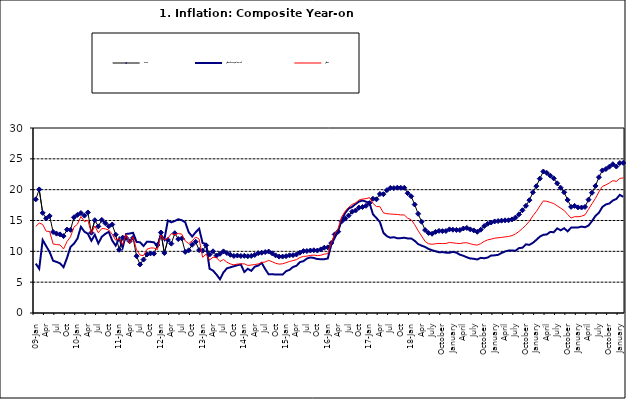
| Category | Food | All Items less Farm Produce | All Items |
|---|---|---|---|
| 09-Jan | 18.436 | 8.013 | 14.034 |
| Feb | 20.041 | 7.178 | 14.584 |
| Mar | 16.233 | 11.842 | 14.366 |
| Apr | 15.342 | 10.85 | 13.268 |
| May | 15.74 | 9.88 | 13.212 |
| June | 13.138 | 8.472 | 11.194 |
| Jul | 12.867 | 8.285 | 11.09 |
| Aug | 12.746 | 8.044 | 11.046 |
| Sep | 12.472 | 7.431 | 10.39 |
| Oct | 13.524 | 8.933 | 11.588 |
| Nov | 13.482 | 10.702 | 12.368 |
| Dec | 15.518 | 11.249 | 13.93 |
| 10-Jan | 15.918 | 12.063 | 14.398 |
| Feb | 16.208 | 13.978 | 15.649 |
| Mar | 15.79 | 13.184 | 14.812 |
| Apr | 16.306 | 12.844 | 15.044 |
| May | 13.023 | 11.711 | 12.915 |
| Jun | 15.053 | 12.686 | 14.099 |
| Jul | 14.043 | 11.287 | 13.002 |
| Aug | 15.09 | 12.366 | 13.702 |
| Sep | 14.57 | 12.83 | 13.65 |
| Oct | 14.065 | 13.168 | 13.45 |
| Nov | 14.351 | 11.746 | 12.766 |
| Dec | 12.701 | 10.917 | 11.815 |
| 11-Jan | 10.255 | 12.118 | 12.08 |
| Feb | 12.221 | 10.569 | 11.1 |
| Mar | 12.169 | 12.815 | 12.779 |
| Apr | 11.629 | 12.882 | 11.291 |
| May | 12.179 | 13.006 | 12.352 |
| Jun | 9.22 | 11.524 | 10.23 |
| Jul | 7.877 | 11.472 | 9.397 |
| Aug | 8.665 | 10.863 | 9.301 |
| Sep | 9.479 | 11.567 | 10.339 |
| Oct | 9.656 | 11.539 | 10.544 |
| Nov | 9.623 | 11.459 | 10.54 |
| Dec | 11.02 | 10.822 | 10.283 |
| 12-Jan | 13.053 | 12.748 | 12.626 |
| 12-Feb | 9.729 | 11.901 | 11.866 |
| 12-Mar | 11.848 | 14.995 | 12.111 |
| Apr | 11.246 | 14.703 | 12.866 |
| May | 12.942 | 14.926 | 12.688 |
| Jun | 11.991 | 15.199 | 12.892 |
| Jul | 12.093 | 15.045 | 12.797 |
| Aug | 9.91 | 14.714 | 11.689 |
| Sep | 10.164 | 13.101 | 11.253 |
| Oct | 11.064 | 12.398 | 11.693 |
| Nov | 11.553 | 13.092 | 12.32 |
| Dec | 10.199 | 13.685 | 11.981 |
| 13-Jan | 10.106 | 11.342 | 9.031 |
| Feb | 10.973 | 11.184 | 9.542 |
| Mar | 9.482 | 7.179 | 8.593 |
| Apr | 10.006 | 6.874 | 9.052 |
| May | 9.321 | 6.227 | 8.964 |
| Jun | 9.606 | 5.472 | 8.353 |
| Jul | 9.994 | 6.58 | 8.682 |
| Aug | 9.723 | 7.245 | 8.231 |
| Sep | 9.437 | 7.41 | 7.952 |
| Oct | 9.249 | 7.579 | 7.807 |
| Nov | 9.313 | 7.75 | 7.931 |
| Dec | 9.253 | 7.872 | 7.957 |
| 14-Jan | 9.271 | 6.648 | 7.977 |
| Feb | 9.207 | 7.166 | 7.707 |
| Mar | 9.254 | 6.836 | 7.783 |
| Apr | 9.414 | 7.508 | 7.851 |
| May | 9.698 | 7.693 | 7.965 |
| Jun | 9.776 | 8.122 | 8.167 |
| Jul | 9.878 | 7.116 | 8.281 |
| Aug | 9.959 | 6.264 | 8.534 |
| Sep | 9.676 | 6.278 | 8.317 |
| Oct | 9.343 | 6.252 | 8.06 |
| Nov | 9.144 | 6.255 | 7.927 |
| Dec | 9.152 | 6.225 | 7.978 |
| 15-Jan | 9.215 | 6.787 | 8.157 |
| Feb | 9.359 | 6.994 | 8.359 |
| Mar | 9.376 | 7.46 | 8.494 |
| Apr | 9.49 | 7.661 | 8.655 |
| May | 9.782 | 8.253 | 9.003 |
| Jun | 10.041 | 8.403 | 9.168 |
| Jul | 10.049 | 8.83 | 9.218 |
| Aug | 10.131 | 9.01 | 9.336 |
| Sep | 10.174 | 8.928 | 9.394 |
| Oct | 10.129 | 8.742 | 9.296 |
| Nov | 10.321 | 8.732 | 9.368 |
| Dec | 10.588 | 8.727 | 9.554 |
| 16-Jan | 10.642 | 8.841 | 9.617 |
| Feb | 11.348 | 11.041 | 11.379 |
| Mar | 12.745 | 12.17 | 12.775 |
| Apr | 13.194 | 13.352 | 13.721 |
| May | 14.861 | 15.054 | 15.577 |
| Jun | 15.302 | 16.224 | 16.48 |
| Jul | 15.799 | 16.929 | 17.127 |
| Aug | 16.427 | 17.208 | 17.609 |
| Sep | 16.622 | 17.666 | 17.852 |
| Oct | 17.09 | 18.067 | 18.33 |
| Nov | 17.191 | 18.241 | 18.476 |
| Dec | 17.388 | 18.052 | 18.547 |
| 17-Jan | 17.818 | 17.867 | 18.719 |
| Feb | 18.528 | 16.011 | 17.78 |
| Mar | 18.436 | 15.404 | 17.256 |
| Apr | 19.303 | 14.75 | 17.244 |
| May | 19.266 | 13.016 | 16.251 |
| Jun | 19.915 | 12.455 | 16.098 |
| Jul | 20.284 | 12.207 | 16.053 |
| Aug | 20.251 | 12.296 | 16.012 |
| Sep | 20.321 | 12.123 | 15.979 |
| Oct | 20.306 | 12.142 | 15.905 |
| Nov | 20.308 | 12.206 | 15.901 |
| Dec | 19.415 | 12.089 | 15.372 |
| 18-Jan | 18.919 | 12.09 | 15.127 |
| Feb | 17.588 | 11.707 | 14.33 |
| Mar | 16.08 | 11.181 | 13.337 |
| Apr | 14.799 | 10.92 | 12.482 |
| May | 13.448 | 10.71 | 11.608 |
| June | 12.977 | 10.387 | 11.231 |
| July | 12.85 | 10.183 | 11.142 |
| August | 13.158 | 10.015 | 11.227 |
| September | 13.309 | 9.838 | 11.284 |
| October | 13.277 | 9.882 | 11.259 |
| November | 13.301 | 9.787 | 11.281 |
| December | 13.559 | 9.771 | 11.442 |
| January | 13.505 | 9.91 | 11.374 |
| February | 13.473 | 9.8 | 11.306 |
| March | 13.451 | 9.461 | 11.251 |
| April | 13.701 | 9.28 | 11.372 |
| May | 13.794 | 9.033 | 11.396 |
| June | 13.558 | 8.841 | 11.217 |
| July | 13.392 | 8.798 | 11.084 |
| August | 13.17 | 8.678 | 11.016 |
| September | 13.507 | 8.945 | 11.244 |
| October | 14.088 | 8.876 | 11.607 |
| November | 14.482 | 8.993 | 11.854 |
| December | 14.667 | 9.331 | 11.982 |
| January | 14.849 | 9.349 | 12.132 |
| February | 14.904 | 9.434 | 12.199 |
| March | 14.977 | 9.732 | 12.257 |
| April | 15.026 | 9.979 | 12.341 |
| May | 15.036 | 10.12 | 12.404 |
| June | 15.175 | 10.128 | 12.559 |
| July | 15.482 | 10.102 | 12.821 |
| August | 15.996 | 10.521 | 13.22 |
| September | 16.66 | 10.581 | 13.707 |
| October | 17.378 | 11.137 | 14.233 |
| November | 18.298 | 11.05 | 14.887 |
| December | 19.562 | 11.374 | 15.753 |
| January | 20.567 | 11.854 | 16.466 |
| February | 21.786 | 12.382 | 17.335 |
| March | 22.948 | 12.673 | 18.171 |
| April | 22.719 | 12.743 | 18.117 |
| May | 22.277 | 13.145 | 17.933 |
| June | 21.829 | 13.094 | 17.751 |
| July | 21.032 | 13.72 | 17.377 |
| August | 20.303 | 13.408 | 17.009 |
| September | 19.566 | 13.745 | 16.63 |
| October | 18.338 | 13.24 | 15.994 |
| November | 17.209 | 13.851 | 15.396 |
| December | 17.37 | 13.873 | 15.625 |
| January | 17.126 | 13.869 | 15.601 |
| February | 17.11 | 14.011 | 15.702 |
| March | 17.203 | 13.914 | 15.915 |
| April | 18.371 | 14.178 | 16.819 |
| May | 19.496 | 14.897 | 17.712 |
| June | 20.603 | 15.747 | 18.596 |
| July | 22.017 | 16.258 | 19.643 |
| August | 23.121 | 17.2 | 20.525 |
| September | 23.336 | 17.601 | 20.774 |
| October | 23.723 | 17.759 | 21.087 |
| November | 24.125 | 18.244 | 21.466 |
| December | 23.754 | 18.492 | 21.344 |
| January | 24.316 | 19.156 | 21.816 |
| February | 24.352 | 18.84 | 21.91 |